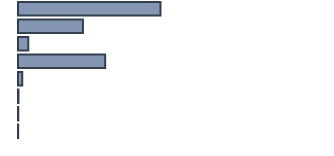
| Category | Series 0 |
|---|---|
| 0 | 45.964 |
| 1 | 20.945 |
| 2 | 3.336 |
| 3 | 28.113 |
| 4 | 1.348 |
| 5 | 0.149 |
| 6 | 0.095 |
| 7 | 0.05 |